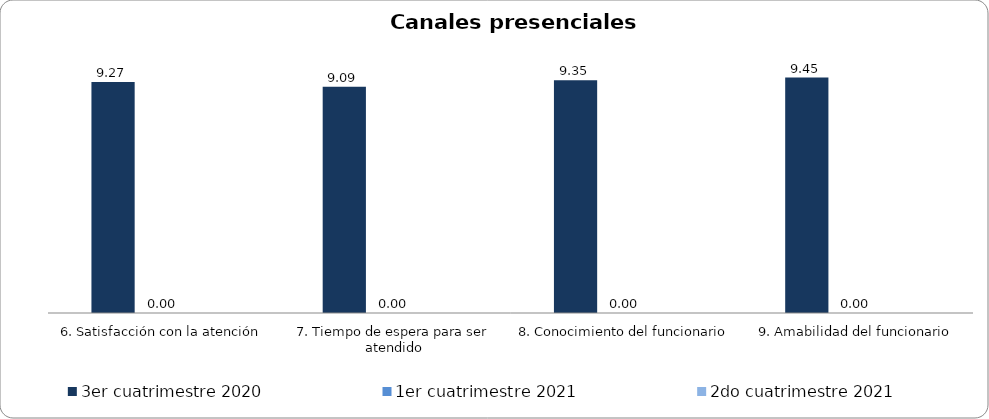
| Category | Septiembre - Octubre 2018 | Noviembre - Diciembre 2018 | 1er cuatrimestre 2019 | 2do cuatrimestre 2019 | 3er cuatrimestre 2020 | 1er cuatrimestre 2021 | 2do cuatrimestre 2021 |
|---|---|---|---|---|---|---|---|
| 6. Satisfacción con la atención |  |  |  |  | 9.273 | 0 | 0 |
| 7. Tiempo de espera para ser atendido |  |  |  |  | 9.091 | 0 | 0 |
| 8. Conocimiento del funcionario |  |  |  |  | 9.351 | 0 | 0 |
| 9. Amabilidad del funcionario |  |  |  |  | 9.455 | 0 | 0 |